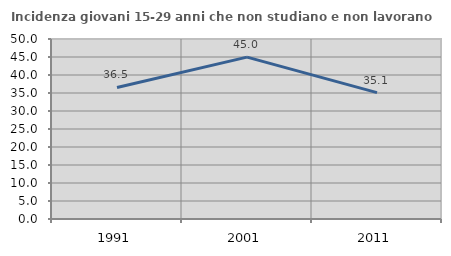
| Category | Incidenza giovani 15-29 anni che non studiano e non lavorano  |
|---|---|
| 1991.0 | 36.545 |
| 2001.0 | 44.957 |
| 2011.0 | 35.094 |